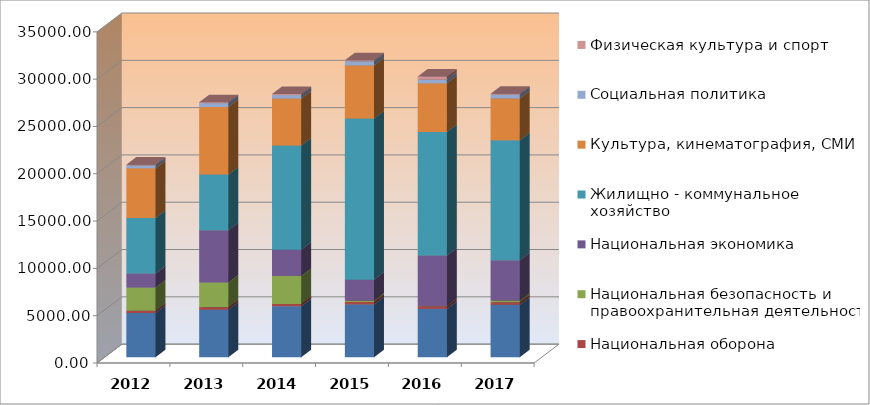
| Category | Общегосударственные вопросы | Национальная оборона | Национальная безопасность и правоохранительная деятельность | Национальная экономика | Жилищно - коммунальное хозяйство | Культура, кинематография, СМИ | Социальная политика | Физическая культура и спорт |
|---|---|---|---|---|---|---|---|---|
| 2012.0 | 4692.164 | 232.812 | 2451.473 | 1471.939 | 5881.889 | 5253.5 | 308.421 | 75 |
| 2013.0 | 5032.062 | 272.794 | 2592.465 | 5537.892 | 5891.897 | 7128.686 | 414.894 | 95 |
| 2014.0 | 5404.168 | 229.8 | 2963.109 | 2766.841 | 11028.448 | 4956.468 | 371.71 | 101 |
| 2015.0 | 5595.761 | 250.1 | 150 | 2216.367 | 17030.049 | 5608.309 | 449.08 | 101 |
| 2016.0 | 5134.802 | 272.9 | 26.962 | 5316.462 | 13058.231 | 5148.907 | 391.486 | 342.75 |
| 2017.0 | 5559.732 | 267.4 | 188.218 | 4253.549 | 12664.6 | 4426.762 | 403.149 | 101 |